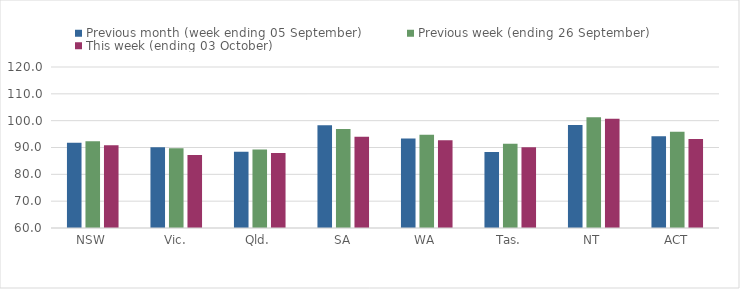
| Category | Previous month (week ending 05 September) | Previous week (ending 26 September) | This week (ending 03 October) |
|---|---|---|---|
| NSW | 91.8 | 92.32 | 90.85 |
| Vic. | 90.06 | 89.73 | 87.24 |
| Qld. | 88.42 | 89.29 | 87.96 |
| SA | 98.33 | 96.85 | 94.03 |
| WA | 93.4 | 94.73 | 92.72 |
| Tas. | 88.33 | 91.38 | 90.1 |
| NT | 98.35 | 101.23 | 100.74 |
| ACT | 94.17 | 95.83 | 93.17 |